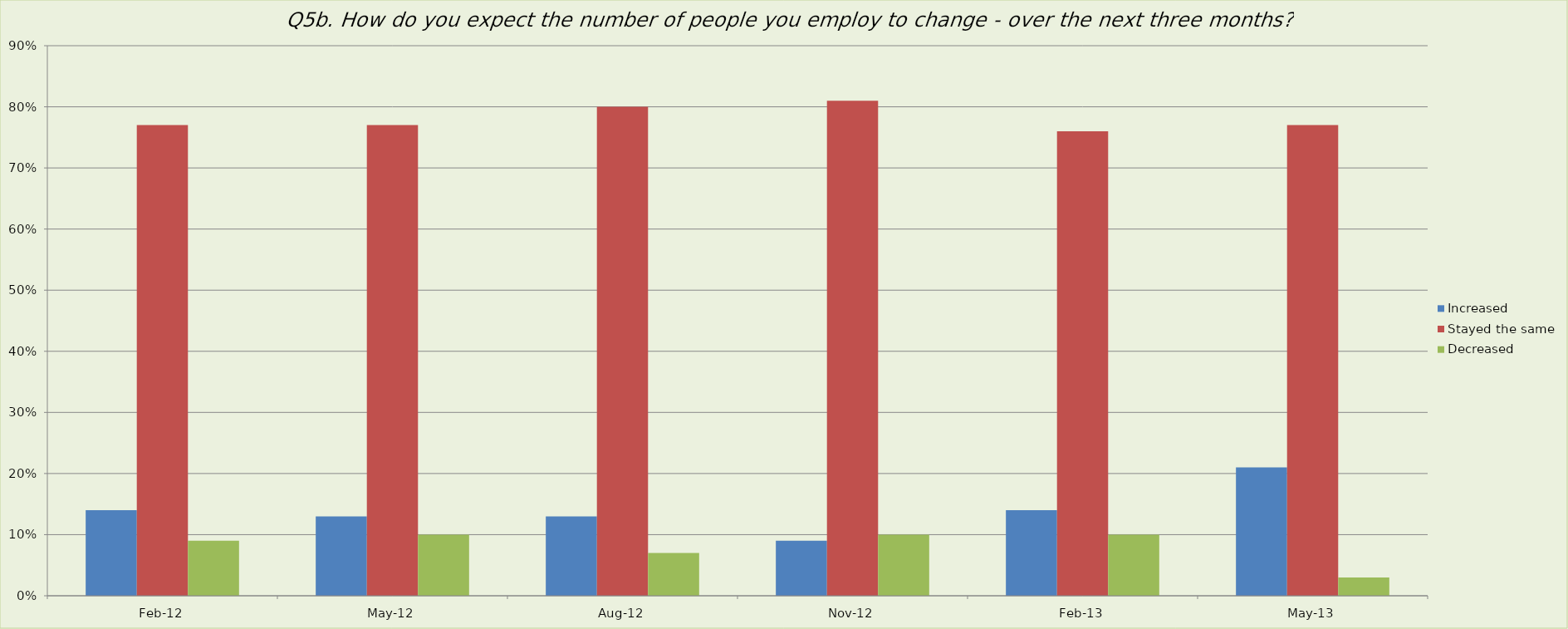
| Category | Increased | Stayed the same | Decreased |
|---|---|---|---|
| 2012-02-01 | 0.14 | 0.77 | 0.09 |
| 2012-05-01 | 0.13 | 0.77 | 0.1 |
| 2012-08-01 | 0.13 | 0.8 | 0.07 |
| 2012-11-01 | 0.09 | 0.81 | 0.1 |
| 2013-02-01 | 0.14 | 0.76 | 0.1 |
| 2013-05-01 | 0.21 | 0.77 | 0.03 |